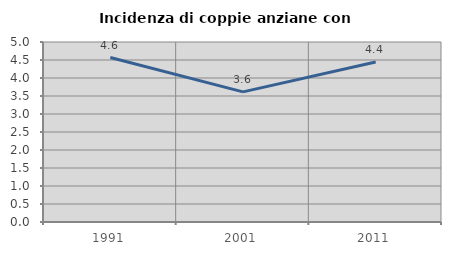
| Category | Incidenza di coppie anziane con figli |
|---|---|
| 1991.0 | 4.569 |
| 2001.0 | 3.614 |
| 2011.0 | 4.444 |